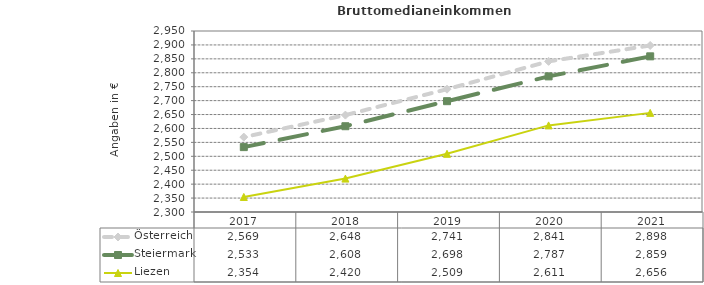
| Category | Österreich | Steiermark | Liezen |
|---|---|---|---|
| 2021.0 | 2898 | 2859 | 2656 |
| 2020.0 | 2841 | 2787 | 2611 |
| 2019.0 | 2741 | 2698 | 2509 |
| 2018.0 | 2648 | 2608 | 2420 |
| 2017.0 | 2569 | 2533 | 2354 |